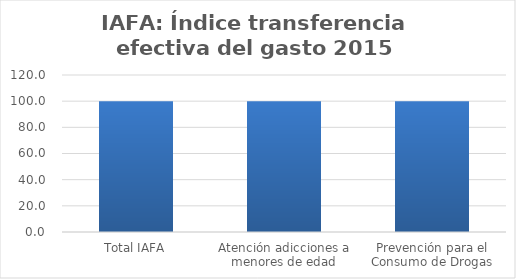
| Category | Índice transferencia efectiva del gasto (ITG) |
|---|---|
| Total IAFA | 100 |
| Atención adicciones a menores de edad | 100 |
| Prevención para el Consumo de Drogas | 100 |